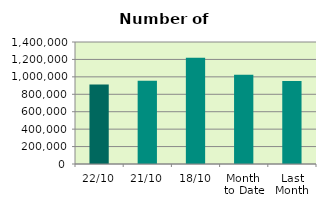
| Category | Series 0 |
|---|---|
| 22/10 | 912240 |
| 21/10 | 955034 |
| 18/10 | 1219058 |
| Month 
to Date | 1022776 |
| Last
Month | 952931.048 |